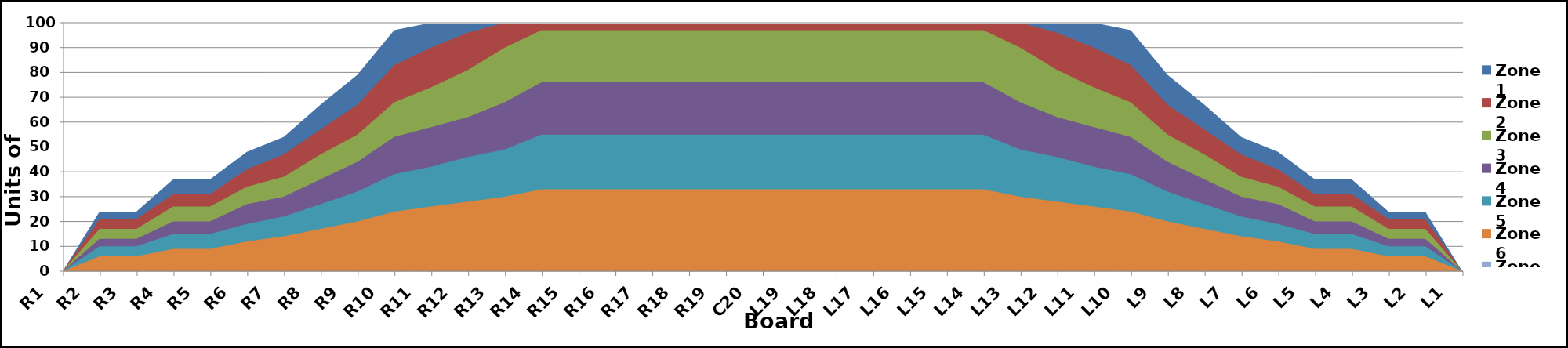
| Category | Zone 1 | Zone 2 | Zone 3 | Zone 4 | Zone 5 | Zone 6 | Zone 7 | Zone 8 |
|---|---|---|---|---|---|---|---|---|
| L1 | 0 | 0 | 0 | 0 | 0 | 0 | 0 | 0 |
| L2 | 24 | 21 | 17 | 13 | 10 | 6 | 0 | 0 |
| L3 | 24 | 21 | 17 | 13 | 10 | 6 | 0 | 0 |
| L4 | 37 | 31 | 26 | 20 | 15 | 9 | 0 | 0 |
| L5 | 37 | 31 | 26 | 20 | 15 | 9 | 0 | 0 |
| L6 | 48 | 41 | 34 | 27 | 19 | 12 | 0 | 0 |
| L7 | 54 | 47 | 38 | 30 | 22 | 14 | 0 | 0 |
| L8 | 67 | 57 | 47 | 37 | 27 | 17 | 0 | 0 |
| L9 | 79 | 67 | 55 | 44 | 32 | 20 | 0 | 0 |
| L10 | 97 | 83 | 68 | 54 | 39 | 24 | 0 | 0 |
| L11 | 100 | 90 | 74 | 58 | 42 | 26 | 0 | 0 |
| L12 | 100 | 96 | 81 | 62 | 46 | 28 | 0 | 0 |
| L13 | 100 | 100 | 90 | 68 | 49 | 30 | 0 | 0 |
| L14 | 100 | 100 | 97 | 76 | 55 | 33 | 0 | 0 |
| L15 | 100 | 100 | 97 | 76 | 55 | 33 | 0 | 0 |
| L16 | 100 | 100 | 97 | 76 | 55 | 33 | 0 | 0 |
| L17 | 100 | 100 | 97 | 76 | 55 | 33 | 0 | 0 |
| L18 | 100 | 100 | 97 | 76 | 55 | 33 | 0 | 0 |
| L19 | 100 | 100 | 97 | 76 | 55 | 33 | 0 | 0 |
| C20 | 100 | 100 | 97 | 76 | 55 | 33 | 0 | 0 |
| R19 | 100 | 100 | 97 | 76 | 55 | 33 | 0 | 0 |
| R18 | 100 | 100 | 97 | 76 | 55 | 33 | 0 | 0 |
| R17 | 100 | 100 | 97 | 76 | 55 | 33 | 0 | 0 |
| R16 | 100 | 100 | 97 | 76 | 55 | 33 | 0 | 0 |
| R15 | 100 | 100 | 97 | 76 | 55 | 33 | 0 | 0 |
| R14 | 100 | 100 | 97 | 76 | 55 | 33 | 0 | 0 |
| R13 | 100 | 100 | 90 | 68 | 49 | 30 | 0 | 0 |
| R12 | 100 | 96 | 81 | 62 | 46 | 28 | 0 | 0 |
| R11 | 100 | 90 | 74 | 58 | 42 | 26 | 0 | 0 |
| R10 | 97 | 83 | 68 | 54 | 39 | 24 | 0 | 0 |
| R9 | 79 | 67 | 55 | 44 | 32 | 20 | 0 | 0 |
| R8 | 67 | 57 | 47 | 37 | 27 | 17 | 0 | 0 |
| R7 | 54 | 47 | 38 | 30 | 22 | 14 | 0 | 0 |
| R6 | 48 | 41 | 34 | 27 | 19 | 12 | 0 | 0 |
| R5 | 37 | 31 | 26 | 20 | 15 | 9 | 0 | 0 |
| R4 | 37 | 31 | 26 | 20 | 15 | 9 | 0 | 0 |
| R3 | 24 | 21 | 17 | 13 | 10 | 6 | 0 | 0 |
| R2 | 24 | 21 | 17 | 13 | 10 | 6 | 0 | 0 |
| R1 | 0 | 0 | 0 | 0 | 0 | 0 | 0 | 0 |